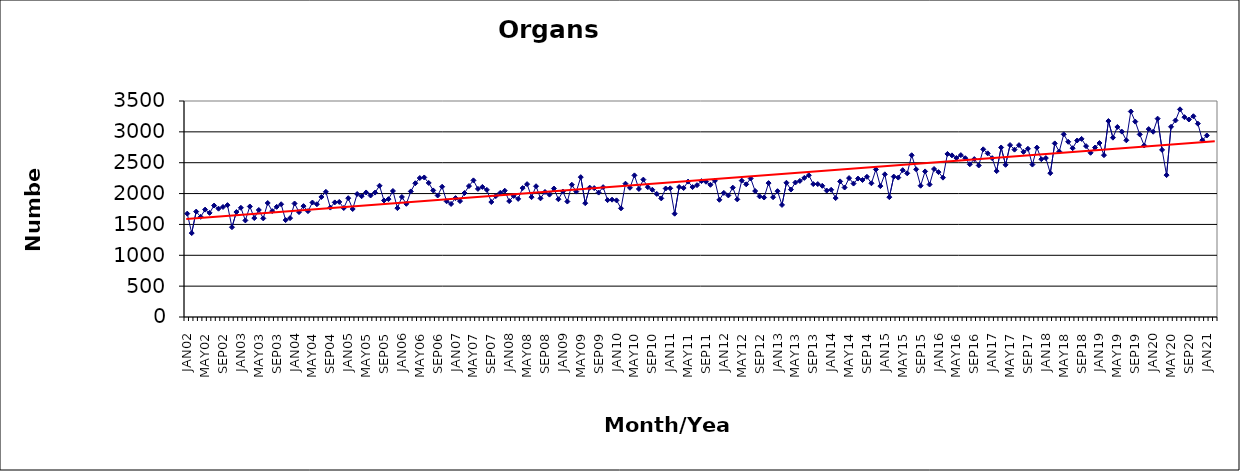
| Category | Series 0 |
|---|---|
| JAN02 | 1675 |
| FEB02 | 1360 |
| MAR02 | 1708 |
| APR02 | 1623 |
| MAY02 | 1740 |
| JUN02 | 1687 |
| JUL02 | 1806 |
| AUG02 | 1755 |
| SEP02 | 1783 |
| OCT02 | 1813 |
| NOV02 | 1455 |
| DEC02 | 1701 |
| JAN03 | 1770 |
| FEB03 | 1565 |
| MAR03 | 1791 |
| APR03 | 1603 |
| MAY03 | 1734 |
| JUN03 | 1598 |
| JUL03 | 1847 |
| AUG03 | 1716 |
| SEP03 | 1785 |
| OCT03 | 1827 |
| NOV03 | 1570 |
| DEC03 | 1602 |
| JAN04 | 1839 |
| FEB04 | 1700 |
| MAR04 | 1797 |
| APR04 | 1715 |
| MAY04 | 1855 |
| JUN04 | 1827 |
| JUL04 | 1945 |
| AUG04 | 2028 |
| SEP04 | 1773 |
| OCT04 | 1857 |
| NOV04 | 1864 |
| DEC04 | 1766 |
| JAN05 | 1925 |
| FEB05 | 1750 |
| MAR05 | 1993 |
| APR05 | 1957 |
| MAY05 | 2018 |
| JUN05 | 1969 |
| JUL05 | 2016 |
| AUG05 | 2127 |
| SEP05 | 1888 |
| OCT05 | 1910 |
| NOV05 | 2042 |
| DEC05 | 1764 |
| JAN06 | 1945 |
| FEB06 | 1834 |
| MAR06 | 2035 |
| APR06 | 2167 |
| MAY06 | 2252 |
| JUN06 | 2261 |
| JUL06 | 2172 |
| AUG06 | 2051 |
| SEP06 | 1969 |
| OCT06 | 2111 |
| NOV06 | 1875 |
| DEC06 | 1832 |
| JAN07 | 1927 |
| FEB07 | 1878 |
| MAR07 | 2009 |
| APR07 | 2122 |
| MAY07 | 2214 |
| JUN07 | 2076 |
| JUL07 | 2108 |
| AUG07 | 2060 |
| SEP07 | 1863 |
| OCT07 | 1959 |
| NOV07 | 2012 |
| DEC07 | 2046 |
| JAN08 | 1878 |
| FEB08 | 1962 |
| MAR08 | 1914 |
| APR08 | 2089 |
| MAY08 | 2153 |
| JUN08 | 1942 |
| JUL08 | 2119 |
| AUG08 | 1923 |
| SEP08 | 2026 |
| OCT08 | 1983 |
| NOV08 | 2082 |
| DEC08 | 1908 |
| JAN09 | 2033 |
| FEB09 | 1871 |
| MAR09 | 2143 |
| APR09 | 2032 |
| MAY09 | 2266 |
| JUN09 | 1844 |
| JUL09 | 2096 |
| AUG09 | 2089 |
| SEP09 | 2016 |
| OCT09 | 2104 |
| NOV09 | 1894 |
| DEC09 | 1901 |
| JAN10 | 1890 |
| FEB10 | 1761 |
| MAR10 | 2160 |
| APR10 | 2094 |
| MAY10 | 2295 |
| JUN10 | 2075 |
| JUL10 | 2226 |
| AUG10 | 2104 |
| SEP10 | 2062 |
| OCT10 | 1994 |
| NOV10 | 1922 |
| DEC10 | 2082 |
| JAN11 | 2085 |
| FEB11 | 1674 |
| MAR11 | 2106 |
| APR11 | 2090 |
| MAY11 | 2194 |
| JUN11 | 2105 |
| JUL11 | 2136 |
| AUG11 | 2202 |
| SEP11 | 2192 |
| OCT11 | 2142 |
| NOV11 | 2207 |
| DEC11 | 1899 |
| JAN12 | 2011 |
| FEB12 | 1970 |
| MAR12 | 2096 |
| APR12 | 1906 |
| MAY12 | 2210 |
| JUN12 | 2150 |
| JUL12 | 2244 |
| AUG12 | 2041 |
| SEP12 | 1954 |
| OCT12 | 1936 |
| NOV12 | 2170 |
| DEC12 | 1941 |
| JAN13 | 2039 |
| FEB13 | 1816 |
| MAR13 | 2175 |
| APR13 | 2065 |
| MAY13 | 2179 |
| JUN13 | 2205 |
| JUL13 | 2254 |
| AUG13 | 2297 |
| SEP13 | 2154 |
| OCT13 | 2154 |
| NOV13 | 2126 |
| DEC13 | 2049 |
| JAN14 | 2061 |
| FEB14 | 1927 |
| MAR14 | 2197 |
| APR14 | 2098 |
| MAY14 | 2251 |
| JUN14 | 2162 |
| JUL14 | 2243 |
| AUG14 | 2220 |
| SEP14 | 2272 |
| OCT14 | 2167 |
| NOV14 | 2391 |
| DEC14 | 2121 |
| JAN15 | 2312 |
| FEB15 | 1942 |
| MAR15 | 2275 |
| APR15 | 2259 |
| MAY15 | 2379 |
| JUN15 | 2328 |
| JUL15 | 2621 |
| AUG15 | 2393 |
| SEP15 | 2127 |
| OCT15 | 2359 |
| NOV15 | 2147 |
| DEC15 | 2398 |
| JAN16 | 2348 |
| FEB16 | 2258 |
| MAR16 | 2642 |
| APR16 | 2619 |
| MAY16 | 2576 |
| JUN16 | 2623 |
| JUL16 | 2573 |
| AUG16 | 2475 |
| SEP16 | 2559 |
| OCT16 | 2455 |
| NOV16 | 2717 |
| DEC16 | 2652 |
| JAN17 | 2574 |
| FEB17 | 2364 |
| MAR17 | 2747 |
| APR17 | 2466 |
| MAY17 | 2786 |
| JUN17 | 2712 |
| JUL17 | 2785 |
| AUG17 | 2676 |
| SEP17 | 2726 |
| OCT17 | 2470 |
| NOV17 | 2745 |
| DEC17 | 2557 |
| JAN18 | 2575 |
| FEB18 | 2331 |
| MAR18 | 2813 |
| APR18 | 2681 |
| MAY18 | 2960 |
| JUN18 | 2839 |
| JUL18 | 2735 |
| AUG18 | 2860 |
| SEP18 | 2886 |
| OCT18 | 2769 |
| NOV18 | 2661 |
| DEC18 | 2746 |
| JAN19 | 2819 |
| FEB19 | 2622 |
| MAR19 | 3175 |
| APR19 | 2906 |
| MAY19 | 3079 |
| JUN19 | 3004 |
| JUL19 | 2863 |
| AUG19 | 3330 |
| SEP19 | 3166 |
| OCT19 | 2958 |
| NOV19 | 2779 |
| DEC19 | 3045 |
| JAN20 | 3002 |
| FEB20 | 3214 |
| MAR20 | 2708 |
| APR20 | 2299 |
| MAY20 | 3082 |
| JUN20 | 3185 |
| JUL20 | 3365 |
| AUG20 | 3238 |
| SEP20 | 3200 |
| OCT20 | 3253 |
| NOV20 | 3133 |
| DEC20 | 2865 |
| JAN21 | 2941 |